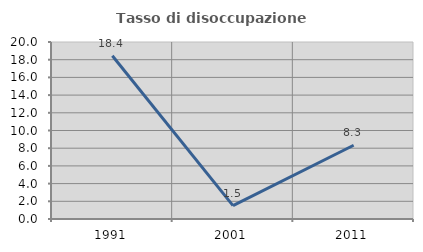
| Category | Tasso di disoccupazione giovanile  |
|---|---|
| 1991.0 | 18.447 |
| 2001.0 | 1.515 |
| 2011.0 | 8.333 |